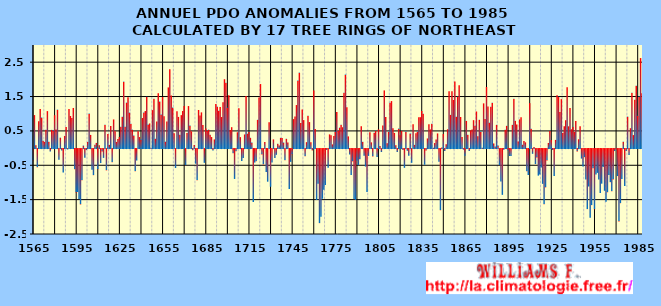
| Category | PDO |
|---|---|
| 1565.0 | -0.329 |
| 1566.0 | 0.96 |
| 1567.0 | 0.086 |
| 1568.0 | -0.531 |
| 1569.0 | 0.784 |
| 1570.0 | 1.14 |
| 1571.0 | 0.89 |
| 1572.0 | 0.211 |
| 1573.0 | 0.18 |
| 1574.0 | 0.53 |
| 1575.0 | 1.076 |
| 1576.0 | 0.182 |
| 1577.0 | -0.071 |
| 1578.0 | 0.53 |
| 1579.0 | 0.509 |
| 1580.0 | 0.956 |
| 1581.0 | 0.543 |
| 1582.0 | 1.12 |
| 1583.0 | -0.314 |
| 1584.0 | 0.305 |
| 1585.0 | -0.042 |
| 1586.0 | -0.684 |
| 1587.0 | 0.354 |
| 1588.0 | 0.613 |
| 1589.0 | -0.013 |
| 1590.0 | 1.136 |
| 1591.0 | 0.934 |
| 1592.0 | 0.874 |
| 1593.0 | 1.168 |
| 1594.0 | -0.586 |
| 1595.0 | -1.261 |
| 1596.0 | -1.251 |
| 1597.0 | -1.45 |
| 1598.0 | -1.611 |
| 1599.0 | -0.909 |
| 1600.0 | 0.074 |
| 1601.0 | -0.251 |
| 1602.0 | -0.026 |
| 1603.0 | 0.18 |
| 1604.0 | 1.005 |
| 1605.0 | 0.384 |
| 1606.0 | -0.599 |
| 1607.0 | -0.76 |
| 1608.0 | 0.098 |
| 1609.0 | 0.152 |
| 1610.0 | -0.589 |
| 1611.0 | 0.082 |
| 1612.0 | -0.406 |
| 1613.0 | -0.068 |
| 1614.0 | -0.256 |
| 1615.0 | 0.681 |
| 1616.0 | -0.619 |
| 1617.0 | 0.41 |
| 1618.0 | 0.093 |
| 1619.0 | 0.646 |
| 1620.0 | -0.384 |
| 1621.0 | 0.834 |
| 1622.0 | 0.487 |
| 1623.0 | 0.18 |
| 1624.0 | 0.267 |
| 1625.0 | 0.324 |
| 1626.0 | 0.618 |
| 1627.0 | 0.914 |
| 1628.0 | 1.935 |
| 1629.0 | 0.617 |
| 1630.0 | 1.324 |
| 1631.0 | 1.482 |
| 1632.0 | 1.034 |
| 1633.0 | 0.706 |
| 1634.0 | 0.537 |
| 1635.0 | 0.366 |
| 1636.0 | -0.643 |
| 1637.0 | -0.333 |
| 1638.0 | 0.487 |
| 1639.0 | 0.32 |
| 1640.0 | 0.247 |
| 1641.0 | 0.875 |
| 1642.0 | 1.033 |
| 1643.0 | 1.078 |
| 1644.0 | 1.498 |
| 1645.0 | 0.684 |
| 1646.0 | 0.717 |
| 1647.0 | 0.01 |
| 1648.0 | 1.105 |
| 1649.0 | 1.434 |
| 1650.0 | 0.272 |
| 1651.0 | 0.776 |
| 1652.0 | 1.592 |
| 1653.0 | 1.355 |
| 1654.0 | 0.975 |
| 1655.0 | 1.487 |
| 1656.0 | 0.929 |
| 1657.0 | 0.188 |
| 1658.0 | 0.776 |
| 1659.0 | 1.765 |
| 1660.0 | 2.297 |
| 1661.0 | 1.532 |
| 1662.0 | 1.181 |
| 1663.0 | 0.435 |
| 1664.0 | -0.551 |
| 1665.0 | 1.075 |
| 1666.0 | 0.908 |
| 1667.0 | 0.39 |
| 1668.0 | 0.958 |
| 1669.0 | 1.08 |
| 1670.0 | 1.225 |
| 1671.0 | -0.468 |
| 1672.0 | 0.437 |
| 1673.0 | 1.223 |
| 1674.0 | 0.655 |
| 1675.0 | 0.487 |
| 1676.0 | -0.03 |
| 1677.0 | 0.094 |
| 1678.0 | -0.424 |
| 1679.0 | -0.903 |
| 1680.0 | 1.108 |
| 1681.0 | 0.949 |
| 1682.0 | 1.039 |
| 1683.0 | 0.668 |
| 1684.0 | -0.399 |
| 1685.0 | 0.573 |
| 1686.0 | 0.507 |
| 1687.0 | 0.537 |
| 1688.0 | 0.387 |
| 1689.0 | 0.321 |
| 1690.0 | -0.044 |
| 1691.0 | 0.252 |
| 1692.0 | 1.285 |
| 1693.0 | 1.206 |
| 1694.0 | 1.087 |
| 1695.0 | 1.193 |
| 1696.0 | 0.904 |
| 1697.0 | 1.335 |
| 1698.0 | 2.004 |
| 1699.0 | 1.903 |
| 1700.0 | 1.18 |
| 1701.0 | 1.54 |
| 1702.0 | 0.528 |
| 1703.0 | 0.608 |
| 1704.0 | -0.124 |
| 1705.0 | -0.869 |
| 1706.0 | -0.061 |
| 1707.0 | 0.46 |
| 1708.0 | 1.157 |
| 1709.0 | 0.319 |
| 1710.0 | -0.344 |
| 1711.0 | -0.256 |
| 1712.0 | 0.396 |
| 1713.0 | 1.513 |
| 1714.0 | 0.42 |
| 1715.0 | 0.478 |
| 1716.0 | 0.3 |
| 1717.0 | 0.162 |
| 1718.0 | -1.538 |
| 1719.0 | -0.391 |
| 1720.0 | -0.355 |
| 1721.0 | 0.824 |
| 1722.0 | 1.476 |
| 1723.0 | 1.864 |
| 1724.0 | -0.157 |
| 1725.0 | -0.446 |
| 1726.0 | 0.177 |
| 1727.0 | -0.668 |
| 1728.0 | -0.949 |
| 1729.0 | 0.754 |
| 1730.0 | -1.095 |
| 1731.0 | -0.392 |
| 1732.0 | 0.253 |
| 1733.0 | -0.262 |
| 1734.0 | -0.167 |
| 1735.0 | 0.126 |
| 1736.0 | 0.078 |
| 1737.0 | 0.299 |
| 1738.0 | 0.297 |
| 1739.0 | 0.163 |
| 1740.0 | -0.323 |
| 1741.0 | 0.271 |
| 1742.0 | 0.164 |
| 1743.0 | -1.159 |
| 1744.0 | -0.371 |
| 1745.0 | -0.152 |
| 1746.0 | 0.844 |
| 1747.0 | 0.922 |
| 1748.0 | 1.252 |
| 1749.0 | 1.964 |
| 1750.0 | 2.197 |
| 1751.0 | 0.727 |
| 1752.0 | 1.126 |
| 1753.0 | 0.814 |
| 1754.0 | -0.212 |
| 1755.0 | 0.172 |
| 1756.0 | 0.944 |
| 1757.0 | 0.757 |
| 1758.0 | 0.168 |
| 1759.0 | -0.038 |
| 1760.0 | 1.679 |
| 1761.0 | 0.557 |
| 1762.0 | -1.483 |
| 1763.0 | -1.005 |
| 1764.0 | -2.155 |
| 1765.0 | -1.968 |
| 1766.0 | -1.445 |
| 1767.0 | -1.187 |
| 1768.0 | -1.046 |
| 1769.0 | -0.023 |
| 1770.0 | -0.543 |
| 1771.0 | 0.398 |
| 1772.0 | 0.371 |
| 1773.0 | 0.108 |
| 1774.0 | 0.349 |
| 1775.0 | 0.482 |
| 1776.0 | 1.05 |
| 1777.0 | 0.5 |
| 1778.0 | 0.596 |
| 1779.0 | 0.678 |
| 1780.0 | 0.607 |
| 1781.0 | 1.61 |
| 1782.0 | 2.141 |
| 1783.0 | 1.186 |
| 1784.0 | 0.34 |
| 1785.0 | -0.158 |
| 1786.0 | -0.752 |
| 1787.0 | -0.358 |
| 1788.0 | -1.46 |
| 1789.0 | -1.482 |
| 1790.0 | -0.332 |
| 1791.0 | -0.466 |
| 1792.0 | -0.298 |
| 1793.0 | 0.637 |
| 1794.0 | 0.184 |
| 1795.0 | -0.192 |
| 1796.0 | -0.509 |
| 1797.0 | -1.249 |
| 1798.0 | -0.198 |
| 1799.0 | 0.458 |
| 1800.0 | 0.166 |
| 1801.0 | -0.214 |
| 1802.0 | 0.444 |
| 1803.0 | 0.506 |
| 1804.0 | -0.23 |
| 1805.0 | 0.544 |
| 1806.0 | 0.061 |
| 1807.0 | -0.085 |
| 1808.0 | 0.66 |
| 1809.0 | 1.679 |
| 1810.0 | 0.907 |
| 1811.0 | 0.142 |
| 1812.0 | 0.479 |
| 1813.0 | 1.321 |
| 1814.0 | 1.368 |
| 1815.0 | 0.577 |
| 1816.0 | 0.442 |
| 1817.0 | 0.081 |
| 1818.0 | -0.087 |
| 1819.0 | 0.57 |
| 1820.0 | 0.375 |
| 1821.0 | 0.498 |
| 1822.0 | -0.028 |
| 1823.0 | -0.545 |
| 1824.0 | 0.48 |
| 1825.0 | -0.049 |
| 1826.0 | -0.191 |
| 1827.0 | 0.423 |
| 1828.0 | -0.4 |
| 1829.0 | 0.691 |
| 1830.0 | 0.094 |
| 1831.0 | 0.435 |
| 1832.0 | 0.482 |
| 1833.0 | 0.896 |
| 1834.0 | 0.898 |
| 1835.0 | 1.08 |
| 1836.0 | 0.996 |
| 1837.0 | -0.455 |
| 1838.0 | -0.039 |
| 1839.0 | 0.281 |
| 1840.0 | 0.697 |
| 1841.0 | 0.543 |
| 1842.0 | 0.711 |
| 1843.0 | 0.011 |
| 1844.0 | 0.146 |
| 1845.0 | 0.25 |
| 1846.0 | 0.426 |
| 1847.0 | -0.369 |
| 1848.0 | -1.78 |
| 1849.0 | 0.018 |
| 1850.0 | 0.408 |
| 1851.0 | -0.059 |
| 1852.0 | 0.111 |
| 1853.0 | 0.547 |
| 1854.0 | 1.653 |
| 1855.0 | 0.966 |
| 1856.0 | 1.654 |
| 1857.0 | 1.401 |
| 1858.0 | 1.938 |
| 1859.0 | 0.912 |
| 1860.0 | 1.5 |
| 1861.0 | 1.832 |
| 1862.0 | 0.905 |
| 1863.0 | 0.32 |
| 1864.0 | -0.016 |
| 1865.0 | -0.197 |
| 1866.0 | 0.792 |
| 1867.0 | 0.392 |
| 1868.0 | -0.055 |
| 1869.0 | 0.512 |
| 1870.0 | 0.543 |
| 1871.0 | 0.812 |
| 1872.0 | 0.646 |
| 1873.0 | 1.065 |
| 1874.0 | 0.342 |
| 1875.0 | 0.824 |
| 1876.0 | 0.481 |
| 1877.0 | 0.011 |
| 1878.0 | 1.301 |
| 1879.0 | 0.85 |
| 1880.0 | 1.777 |
| 1881.0 | 1.212 |
| 1882.0 | 0.739 |
| 1883.0 | 1.201 |
| 1884.0 | 1.318 |
| 1885.0 | 0.134 |
| 1886.0 | 0.045 |
| 1887.0 | 0.678 |
| 1888.0 | 0.072 |
| 1889.0 | -0.465 |
| 1890.0 | -0.944 |
| 1891.0 | -1.331 |
| 1892.0 | -0.022 |
| 1893.0 | 0.537 |
| 1894.0 | 0.648 |
| 1895.0 | -0.043 |
| 1896.0 | -0.201 |
| 1897.0 | -0.201 |
| 1898.0 | 0.677 |
| 1899.0 | 1.438 |
| 1900.0 | 0.794 |
| 1901.0 | 0.687 |
| 1902.0 | 0.192 |
| 1903.0 | 0.834 |
| 1904.0 | 0.896 |
| 1905.0 | 0.098 |
| 1906.0 | 0.205 |
| 1907.0 | 0.168 |
| 1908.0 | -0.642 |
| 1909.0 | -0.751 |
| 1910.0 | 1.308 |
| 1911.0 | 0.562 |
| 1912.0 | -0.138 |
| 1913.0 | 0.031 |
| 1914.0 | -0.437 |
| 1915.0 | -0.244 |
| 1916.0 | -0.773 |
| 1917.0 | -0.743 |
| 1918.0 | -0.538 |
| 1919.0 | -1.012 |
| 1920.0 | -1.603 |
| 1921.0 | -1.114 |
| 1922.0 | -0.329 |
| 1923.0 | 0.149 |
| 1924.0 | 0.505 |
| 1925.0 | 0.232 |
| 1926.0 | -0.027 |
| 1927.0 | -0.782 |
| 1928.0 | 0.238 |
| 1929.0 | 1.535 |
| 1930.0 | 1.496 |
| 1931.0 | 1.05 |
| 1932.0 | 1.424 |
| 1933.0 | 0.439 |
| 1934.0 | 0.635 |
| 1935.0 | 0.81 |
| 1936.0 | 1.768 |
| 1937.0 | 0.633 |
| 1938.0 | 1.166 |
| 1939.0 | 0.548 |
| 1940.0 | 0.624 |
| 1941.0 | 0.468 |
| 1942.0 | 0.786 |
| 1943.0 | -0.069 |
| 1944.0 | 0.256 |
| 1945.0 | 0.638 |
| 1946.0 | -0.277 |
| 1947.0 | -0.509 |
| 1948.0 | -0.235 |
| 1949.0 | -0.888 |
| 1950.0 | -1.747 |
| 1951.0 | -1.089 |
| 1952.0 | -2 |
| 1953.0 | -1.631 |
| 1954.0 | -0.555 |
| 1955.0 | -1.754 |
| 1956.0 | -0.742 |
| 1957.0 | -0.692 |
| 1958.0 | -0.888 |
| 1959.0 | -1.278 |
| 1960.0 | -1.006 |
| 1961.0 | -0.52 |
| 1962.0 | -1.213 |
| 1963.0 | -1.536 |
| 1964.0 | -1.257 |
| 1965.0 | -0.752 |
| 1966.0 | -0.963 |
| 1967.0 | -1.23 |
| 1968.0 | -0.883 |
| 1969.0 | -0.058 |
| 1970.0 | -0.006 |
| 1971.0 | -0.785 |
| 1972.0 | -2.106 |
| 1973.0 | -1.575 |
| 1974.0 | -0.867 |
| 1975.0 | 0.187 |
| 1976.0 | -1.076 |
| 1977.0 | -0.059 |
| 1978.0 | 0.917 |
| 1979.0 | -0.173 |
| 1980.0 | 0.578 |
| 1981.0 | 1.607 |
| 1982.0 | 0.378 |
| 1983.0 | 1.409 |
| 1984.0 | 1.817 |
| 1985.0 | 0.941 |
| 1986.0 | 1.498 |
| 1987.0 | 2.62 |
| 1988.0 | 1.598 |